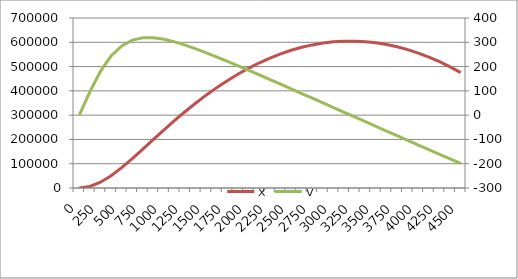
| Category | x |
|---|---|
| 0.0 | 0 |
| 125.0 | 6115.463 |
| 250.0 | 23618.421 |
| 375.0 | 50345.742 |
| 500.0 | 83614.114 |
| 625.0 | 120912.872 |
| 750.0 | 160244.813 |
| 875.0 | 200165.577 |
| 1000.0 | 239672.819 |
| 1125.0 | 278105.87 |
| 1250.0 | 315027.668 |
| 1375.0 | 350145.532 |
| 1500.0 | 383269.835 |
| 1625.0 | 414271.162 |
| 1750.0 | 443058.625 |
| 1875.0 | 469577.232 |
| 2000.0 | 493781.275 |
| 2125.0 | 515639.847 |
| 2250.0 | 535134.991 |
| 2375.0 | 552249.836 |
| 2500.0 | 566971.223 |
| 2625.0 | 579292.157 |
| 2750.0 | 589207.631 |
| 2875.0 | 596712.848 |
| 3000.0 | 601804.575 |
| 3125.0 | 604479.255 |
| 3250.0 | 604737.49 |
| 3375.0 | 602579.88 |
| 3500.0 | 598007.025 |
| 3625.0 | 591021.534 |
| 3750.0 | 581622.496 |
| 3875.0 | 569814.392 |
| 4000.0 | 555605.51 |
| 4125.0 | 539004.138 |
| 4250.0 | 520019.317 |
| 4375.0 | 498664.321 |
| 4500.0 | 474960.991 |